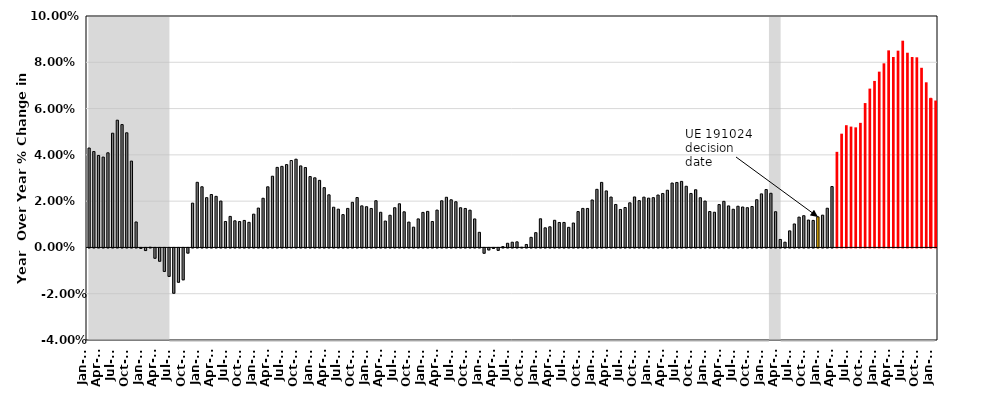
| Category | Series 0 |
|---|---|
| 2008-01-01 | 0.043 |
| 2008-02-01 | 0.041 |
| 2008-03-01 | 0.04 |
| 2008-04-01 | 0.039 |
| 2008-05-01 | 0.041 |
| 2008-06-01 | 0.049 |
| 2008-07-01 | 0.055 |
| 2008-08-01 | 0.053 |
| 2008-09-01 | 0.05 |
| 2008-10-01 | 0.037 |
| 2008-11-01 | 0.011 |
| 2008-12-01 | 0 |
| 2009-01-01 | -0.001 |
| 2009-02-01 | 0 |
| 2009-03-01 | -0.004 |
| 2009-04-01 | -0.006 |
| 2009-05-01 | -0.01 |
| 2009-06-01 | -0.012 |
| 2009-07-01 | -0.02 |
| 2009-08-01 | -0.015 |
| 2009-09-01 | -0.014 |
| 2009-10-01 | -0.002 |
| 2009-11-01 | 0.019 |
| 2009-12-01 | 0.028 |
| 2010-01-01 | 0.026 |
| 2010-02-01 | 0.022 |
| 2010-03-01 | 0.023 |
| 2010-04-01 | 0.022 |
| 2010-05-01 | 0.02 |
| 2010-06-01 | 0.011 |
| 2010-07-01 | 0.013 |
| 2010-08-01 | 0.012 |
| 2010-09-01 | 0.011 |
| 2010-10-01 | 0.012 |
| 2010-11-01 | 0.011 |
| 2010-12-01 | 0.014 |
| 2011-01-01 | 0.017 |
| 2011-02-01 | 0.021 |
| 2011-03-01 | 0.026 |
| 2011-04-01 | 0.031 |
| 2011-05-01 | 0.035 |
| 2011-06-01 | 0.035 |
| 2011-07-01 | 0.036 |
| 2011-08-01 | 0.038 |
| 2011-09-01 | 0.038 |
| 2011-10-01 | 0.035 |
| 2011-11-01 | 0.035 |
| 2011-12-01 | 0.031 |
| 2012-01-01 | 0.03 |
| 2012-02-01 | 0.029 |
| 2012-03-01 | 0.026 |
| 2012-04-01 | 0.023 |
| 2012-05-01 | 0.017 |
| 2012-06-01 | 0.017 |
| 2012-07-01 | 0.014 |
| 2012-08-01 | 0.017 |
| 2012-09-01 | 0.019 |
| 2012-10-01 | 0.022 |
| 2012-11-01 | 0.018 |
| 2012-12-01 | 0.018 |
| 2013-01-01 | 0.017 |
| 2013-02-01 | 0.02 |
| 2013-03-01 | 0.015 |
| 2013-04-01 | 0.011 |
| 2013-05-01 | 0.014 |
| 2013-06-01 | 0.017 |
| 2013-07-01 | 0.019 |
| 2013-08-01 | 0.015 |
| 2013-09-01 | 0.011 |
| 2013-10-01 | 0.009 |
| 2013-11-01 | 0.012 |
| 2013-12-01 | 0.015 |
| 2014-01-01 | 0.016 |
| 2014-02-01 | 0.011 |
| 2014-03-01 | 0.016 |
| 2014-04-01 | 0.02 |
| 2014-05-01 | 0.022 |
| 2014-06-01 | 0.021 |
| 2014-07-01 | 0.02 |
| 2014-08-01 | 0.017 |
| 2014-09-01 | 0.017 |
| 2014-10-01 | 0.016 |
| 2014-11-01 | 0.012 |
| 2014-12-01 | 0.007 |
| 2015-01-01 | -0.002 |
| 2015-02-01 | -0.001 |
| 2015-03-01 | 0 |
| 2015-04-01 | -0.001 |
| 2015-05-01 | 0 |
| 2015-06-01 | 0.002 |
| 2015-07-01 | 0.002 |
| 2015-08-01 | 0.002 |
| 2015-09-01 | 0 |
| 2015-10-01 | 0.001 |
| 2015-11-01 | 0.004 |
| 2015-12-01 | 0.006 |
| 2016-01-01 | 0.012 |
| 2016-02-01 | 0.008 |
| 2016-03-01 | 0.009 |
| 2016-04-01 | 0.012 |
| 2016-05-01 | 0.011 |
| 2016-06-01 | 0.011 |
| 2016-07-01 | 0.009 |
| 2016-08-01 | 0.011 |
| 2016-09-01 | 0.015 |
| 2016-10-01 | 0.017 |
| 2016-11-01 | 0.017 |
| 2016-12-01 | 0.021 |
| 2017-01-01 | 0.025 |
| 2017-02-01 | 0.028 |
| 2017-03-01 | 0.024 |
| 2017-04-01 | 0.022 |
| 2017-05-01 | 0.019 |
| 2017-06-01 | 0.016 |
| 2017-07-01 | 0.017 |
| 2017-08-01 | 0.019 |
| 2017-09-01 | 0.022 |
| 2017-10-01 | 0.02 |
| 2017-11-01 | 0.022 |
| 2017-12-01 | 0.021 |
| 2018-01-01 | 0.022 |
| 2018-02-01 | 0.023 |
| 2018-03-01 | 0.023 |
| 2018-04-01 | 0.025 |
| 2018-05-01 | 0.028 |
| 2018-06-01 | 0.028 |
| 2018-07-01 | 0.029 |
| 2018-08-01 | 0.026 |
| 2018-09-01 | 0.023 |
| 2018-10-01 | 0.025 |
| 2018-11-01 | 0.021 |
| 2018-12-01 | 0.02 |
| 2019-01-01 | 0.016 |
| 2019-02-01 | 0.015 |
| 2019-03-01 | 0.019 |
| 2019-04-01 | 0.02 |
| 2019-05-01 | 0.018 |
| 2019-06-01 | 0.016 |
| 2019-07-01 | 0.018 |
| 2019-08-01 | 0.017 |
| 2019-09-01 | 0.017 |
| 2019-10-01 | 0.018 |
| 2019-11-01 | 0.021 |
| 2019-12-01 | 0.023 |
| 2020-01-01 | 0.025 |
| 2020-02-01 | 0.023 |
| 2020-03-01 | 0.015 |
| 2020-04-01 | 0.003 |
| 2020-05-01 | 0.002 |
| 2020-06-01 | 0.007 |
| 2020-07-01 | 0.01 |
| 2020-08-01 | 0.013 |
| 2020-09-01 | 0.014 |
| 2020-10-01 | 0.012 |
| 2020-11-01 | 0.012 |
| 2020-12-01 | 0.013 |
| 2021-01-01 | 0.014 |
| 2021-02-01 | 0.017 |
| 2021-03-01 | 0.026 |
| 2021-04-01 | 0.041 |
| 2021-05-01 | 0.049 |
| 2021-06-01 | 0.053 |
| 2021-07-01 | 0.052 |
| 2021-08-01 | 0.052 |
| 2021-09-01 | 0.054 |
| 2021-10-01 | 0.062 |
| 2021-11-01 | 0.069 |
| 2021-12-01 | 0.072 |
| 2022-01-01 | 0.076 |
| 2022-02-01 | 0.08 |
| 2022-03-01 | 0.085 |
| 2022-04-01 | 0.082 |
| 2022-05-01 | 0.085 |
| 2022-06-01 | 0.089 |
| 2022-07-01 | 0.084 |
| 2022-08-01 | 0.082 |
| 2022-09-01 | 0.082 |
| 2022-10-01 | 0.078 |
| 2022-11-01 | 0.071 |
| 2022-12-01 | 0.064 |
| 2023-01-01 | 0.063 |